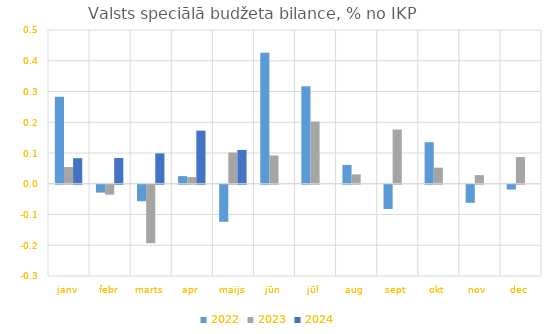
| Category | 2022 | 2023 | 2024 |
|---|---|---|---|
| janv | 0.283 | 0.054 | 0.083 |
| febr | -0.026 | -0.032 | 0.084 |
| marts | -0.054 | -0.19 | 0.099 |
| apr | 0.025 | 0.022 | 0.173 |
| maijs | -0.12 | 0.101 | 0.11 |
| jūn | 0.426 | 0.092 | 0 |
| jūl | 0.317 | 0.202 | 0 |
| aug | 0.061 | 0.031 | 0 |
| sept | -0.079 | 0.176 | 0 |
| okt | 0.135 | 0.052 | 0 |
| nov | -0.059 | 0.028 | 0 |
| dec | -0.015 | 0.087 | 0 |